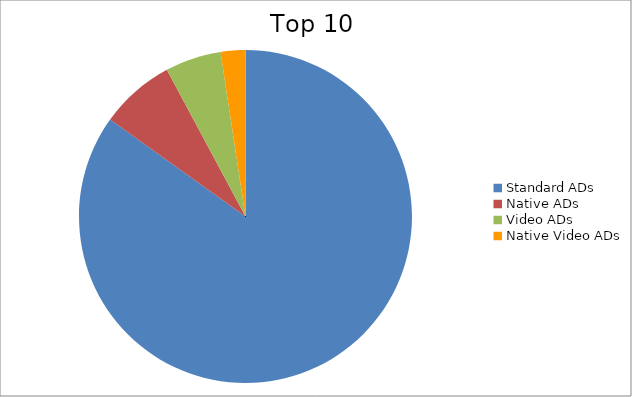
| Category | Series 0 |
|---|---|
| Standard ADs | 84.89 |
| Native ADs | 7.28 |
| Video ADs | 5.43 |
| Native Video ADs | 2.4 |